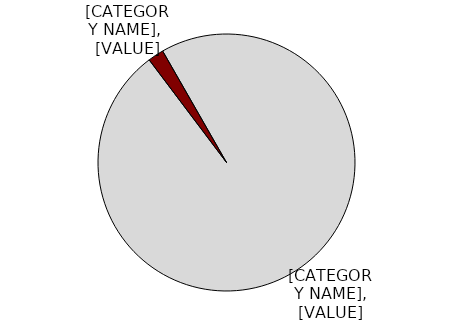
| Category | Series 0 |
|---|---|
| Public safety retirement benefits | 0.02 |
| All other spending | 0.98 |